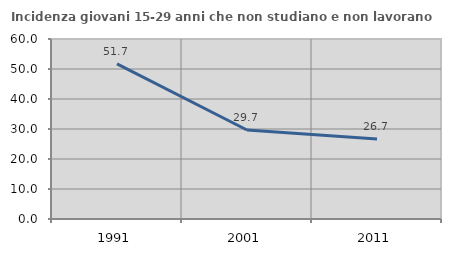
| Category | Incidenza giovani 15-29 anni che non studiano e non lavorano  |
|---|---|
| 1991.0 | 51.685 |
| 2001.0 | 29.663 |
| 2011.0 | 26.667 |